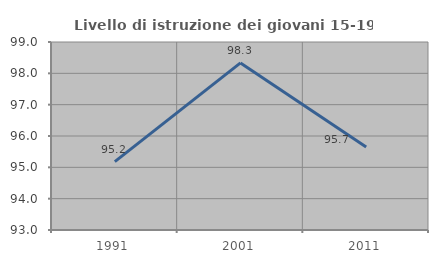
| Category | Livello di istruzione dei giovani 15-19 anni |
|---|---|
| 1991.0 | 95.181 |
| 2001.0 | 98.333 |
| 2011.0 | 95.652 |